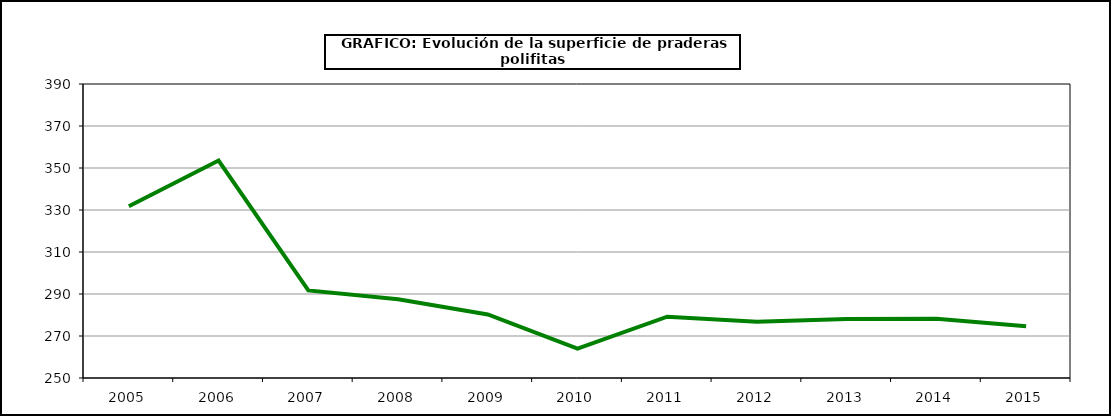
| Category | Superficie |
|---|---|
| 2005.0 | 331.747 |
| 2006.0 | 353.544 |
| 2007.0 | 291.688 |
| 2008.0 | 287.487 |
| 2009.0 | 280.266 |
| 2010.0 | 264.037 |
| 2011.0 | 279.178 |
| 2012.0 | 276.784 |
| 2013.0 | 278.082 |
| 2014.0 | 278.257 |
| 2015.0 | 274.641 |